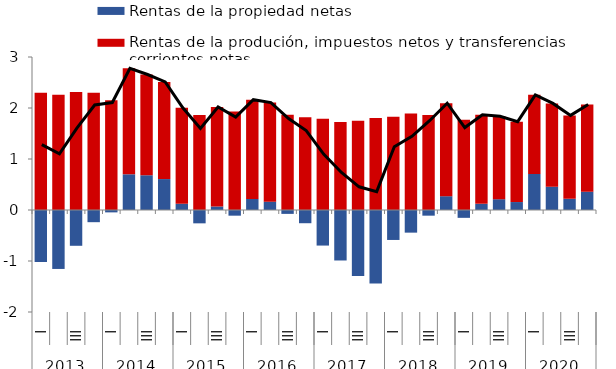
| Category | Rentas de la propiedad netas | Rentas de la produción, impuestos netos y transferencias corrientes netas |
|---|---|---|
| 0 | -1.019 | 2.3 |
| 1 | -1.156 | 2.257 |
| 2 | -0.702 | 2.313 |
| 3 | -0.239 | 2.298 |
| 4 | -0.047 | 2.154 |
| 5 | 0.7 | 2.077 |
| 6 | 0.681 | 1.976 |
| 7 | 0.606 | 1.905 |
| 8 | 0.122 | 1.881 |
| 9 | -0.262 | 1.862 |
| 10 | 0.069 | 1.951 |
| 11 | -0.111 | 1.932 |
| 12 | 0.218 | 1.944 |
| 13 | 0.163 | 1.944 |
| 14 | -0.076 | 1.869 |
| 15 | -0.259 | 1.817 |
| 16 | -0.698 | 1.788 |
| 17 | -0.99 | 1.725 |
| 18 | -1.294 | 1.749 |
| 19 | -1.442 | 1.802 |
| 20 | -0.587 | 1.826 |
| 21 | -0.444 | 1.89 |
| 22 | -0.111 | 1.861 |
| 23 | 0.27 | 1.823 |
| 24 | -0.154 | 1.77 |
| 25 | 0.121 | 1.748 |
| 26 | 0.212 | 1.625 |
| 27 | 0.156 | 1.577 |
| 28 | 0.708 | 1.55 |
| 29 | 0.457 | 1.633 |
| 30 | 0.219 | 1.636 |
| 31 | 0.359 | 1.709 |